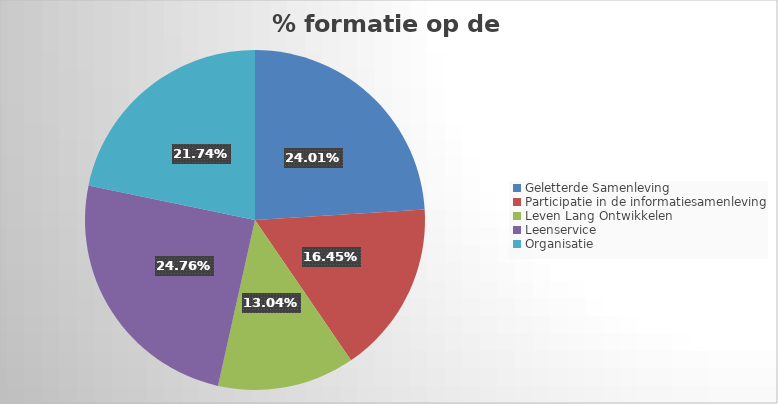
| Category | % formatie op de lijnen |
|---|---|
| Geletterde Samenleving | 0.24 |
| Participatie in de informatiesamenleving | 0.164 |
| Leven Lang Ontwikkelen | 0.13 |
| Leenservice | 0.248 |
| Organisatie | 0.217 |